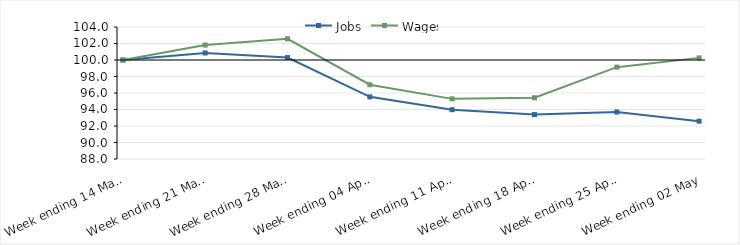
| Category | Jobs | Wages |
|---|---|---|
| 2020-03-14 | 100 | 100 |
| 2020-03-21 | 100.852 | 101.809 |
| 2020-03-28 | 100.295 | 102.575 |
| 2020-04-04 | 95.533 | 97.004 |
| 2020-04-11 | 93.98 | 95.289 |
| 2020-04-18 | 93.382 | 95.42 |
| 2020-04-25 | 93.694 | 99.134 |
| 2020-05-02 | 92.584 | 100.258 |